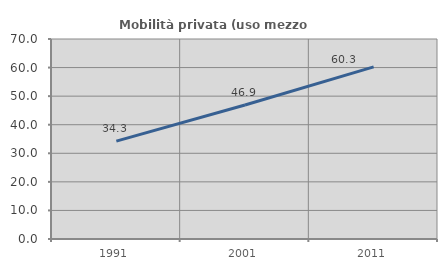
| Category | Mobilità privata (uso mezzo privato) |
|---|---|
| 1991.0 | 34.269 |
| 2001.0 | 46.917 |
| 2011.0 | 60.263 |